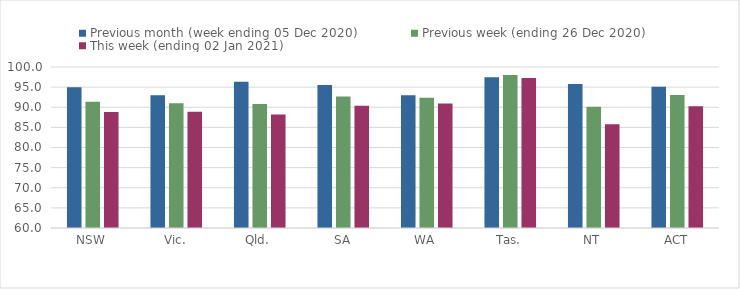
| Category | Previous month (week ending 05 Dec 2020) | Previous week (ending 26 Dec 2020) | This week (ending 02 Jan 2021) |
|---|---|---|---|
| NSW | 94.99 | 91.34 | 88.85 |
| Vic. | 92.98 | 90.98 | 88.88 |
| Qld. | 96.31 | 90.83 | 88.19 |
| SA | 95.51 | 92.64 | 90.38 |
| WA | 92.97 | 92.39 | 90.92 |
| Tas. | 97.43 | 98 | 97.28 |
| NT | 95.76 | 90.1 | 85.8 |
| ACT | 95.11 | 93.05 | 90.24 |